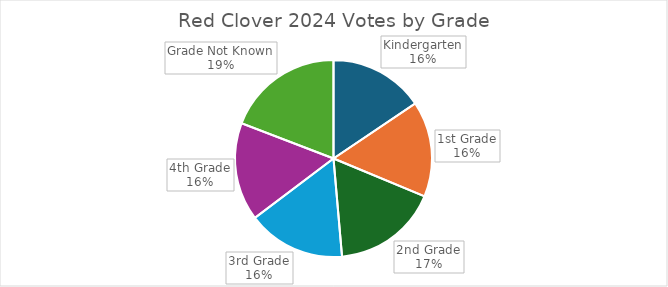
| Category | Votes |
|---|---|
| Kindergarten | 2576 |
| 1st Grade | 2599 |
| 2nd Grade | 2871 |
| 3rd Grade | 2663 |
| 4th Grade | 2667 |
| Grade Not Known | 3174 |